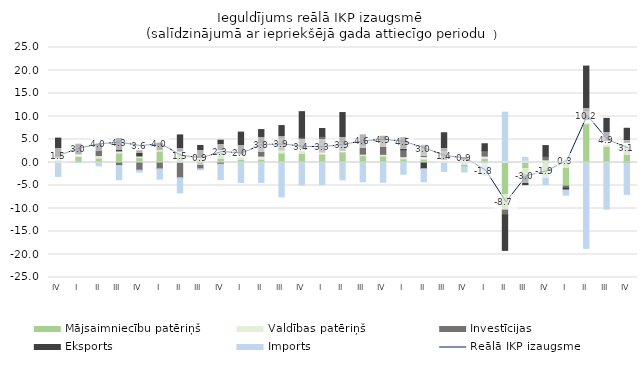
| Category | Mājsaimniecību patēriņš | Valdības patēriņš | Investīcijas | Eksports | Imports |
|---|---|---|---|---|---|
| IV | 0.524 | 0.633 | 0.238 | 3.907 | -3.032 |
| I | 1.292 | 0.595 | 0.024 | 2.073 | -0.008 |
| II | 0.957 | 0.546 | 1.114 | 1.376 | -0.73 |
| III | 2.021 | 0.495 | -0.672 | 2.712 | -3.08 |
| IV | 1.05 | 0.366 | -1.67 | 1.14 | -0.425 |
| I | 2.447 | 0.323 | -1.389 | 1.435 | -2.222 |
| II | 2.16 | 0.314 | -3.328 | 3.529 | -3.29 |
| III | 0.891 | 0.38 | -1.379 | 2.437 | -0.2 |
| IV | 2.229 | 0.537 | -0.378 | 2.079 | -3.341 |
| I | 1.204 | 0.599 | 0.319 | 4.488 | -4.356 |
| II | 0.711 | 0.678 | 2.98 | 2.794 | -4.356 |
| III | 2.048 | 0.652 | 2.631 | 2.692 | -7.467 |
| IV | 2.609 | 0.535 | 2.344 | 5.567 | -4.884 |
| I | 1.815 | 0.427 | 3.445 | 1.708 | -4.825 |
| II | 2.275 | 0.33 | 1.821 | 6.434 | -3.775 |
| III | 1.489 | 0.317 | 2.036 | 2.184 | -4.185 |
| IV | 1.392 | 0.386 | 3.024 | 0.908 | -4.3 |
| I | 0.771 | 0.499 | 1.488 | 2.634 | -2.554 |
| II | 0.706 | 0.591 | 2.447 | -1.365 | -2.812 |
| III | 0.049 | 0.624 | 1.976 | 3.822 | -1.936 |
| IV | -0.963 | 0.582 | 0.254 | 0.168 | -1.1 |
| I | 0.883 | 0.509 | 1.191 | 1.496 | -2.783 |
| II | -10.436 | 0.435 | -0.957 | -7.712 | 10.51 |
| III | -2.692 | 0.483 | -0.409 | -1.708 | 0.643 |
| IV | -2.939 | 0.585 | 0.783 | 2.313 | -1.873 |
| I | -5.13 | 0.708 | -0.422 | -0.43 | -1.135 |
| II | 8.4 | 0.93 | 1.965 | 9.668 | -18.683 |
| III | 3.873 | 0.893 | 0.953 | 3.872 | -10.14 |
| IV | 3.517 | 0.863 | -0.065 | 3.061 | -6.863 |